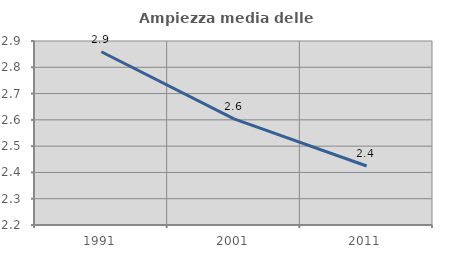
| Category | Ampiezza media delle famiglie |
|---|---|
| 1991.0 | 2.859 |
| 2001.0 | 2.604 |
| 2011.0 | 2.424 |